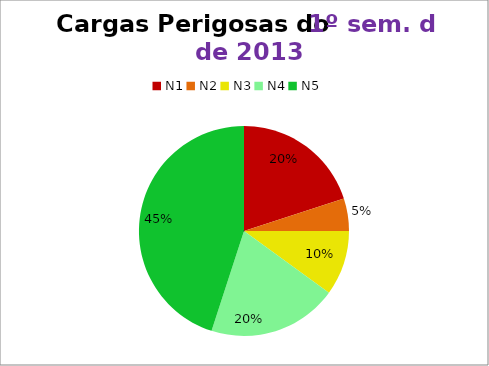
| Category | 1º/13 |
|---|---|
| N1 | 4 |
| N2 | 1 |
| N3 | 2 |
| N4 | 4 |
| N5 | 9 |